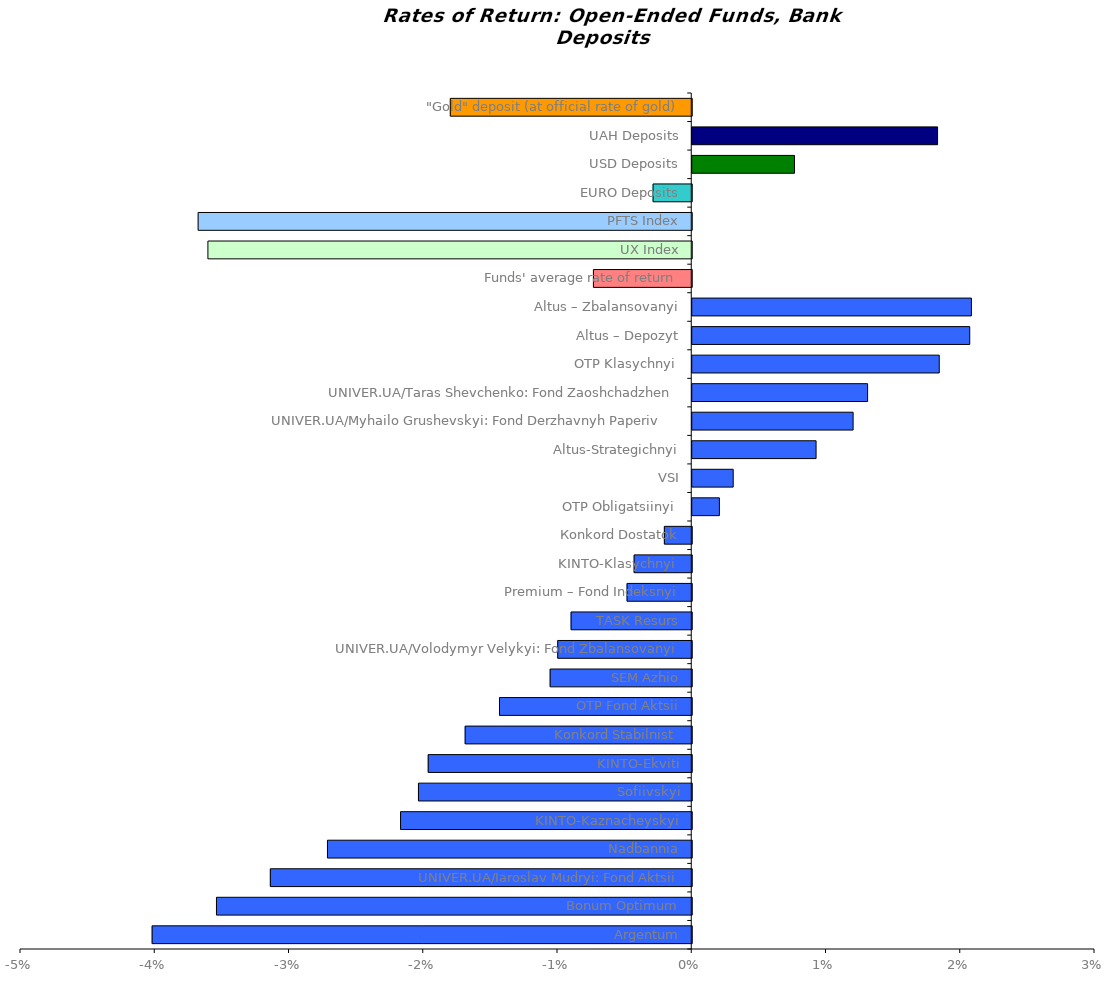
| Category | Series 0 |
|---|---|
| Argentum | -0.04 |
| Bonum Optimum | -0.035 |
| UNIVER.UA/Iaroslav Mudryi: Fond Aktsii | -0.031 |
| Nadbannia | -0.027 |
| KINTO-Kaznacheyskyi | -0.022 |
| Sofiivskyi | -0.02 |
| KINTO-Ekviti | -0.02 |
| Konkord Stabilnist  | -0.017 |
| OTP Fond Aktsii | -0.014 |
| SEM Azhio | -0.011 |
| UNIVER.UA/Volodymyr Velykyi: Fond Zbalansovanyi | -0.01 |
| TASK Resurs | -0.009 |
| Premium – Fond Indeksnyi | -0.005 |
| KINTO-Klasychnyi  | -0.004 |
| Коnkord Dostatok | -0.002 |
| OTP Obligatsiinyi  | 0.002 |
| VSI | 0.003 |
| Altus-Strategichnyi | 0.009 |
| UNIVER.UA/Myhailo Grushevskyi: Fond Derzhavnyh Paperiv    | 0.012 |
| UNIVER.UA/Taras Shevchenko: Fond Zaoshchadzhen | 0.013 |
| OTP Klasychnyi  | 0.018 |
| Altus – Depozyt | 0.021 |
| Altus – Zbalansovanyi | 0.021 |
| Funds' average rate of return | -0.007 |
| UX Index | -0.036 |
| PFTS Index | -0.037 |
| EURO Deposits | -0.003 |
| USD Deposits | 0.008 |
| UAH Deposits | 0.018 |
| "Gold" deposit (at official rate of gold) | -0.018 |